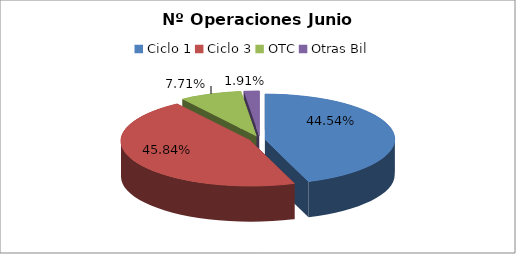
| Category | Series 0 |
|---|---|
| Ciclo 1 | 48087 |
| Ciclo 3 | 49488 |
| OTC | 8324 |
| Otras Bil | 2057 |